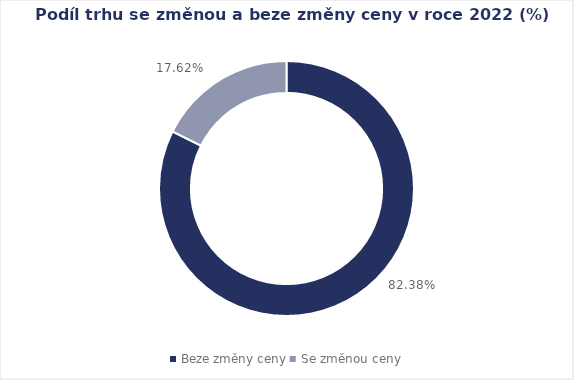
| Category | Series 0 |
|---|---|
| Beze změny ceny | 0.824 |
| Se změnou ceny | 0.176 |